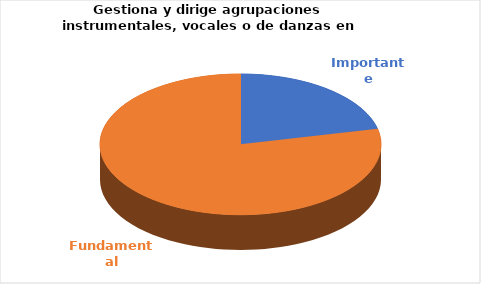
| Category | Series 0 |
|---|---|
| Importante | 3 |
| Fundamental | 11 |